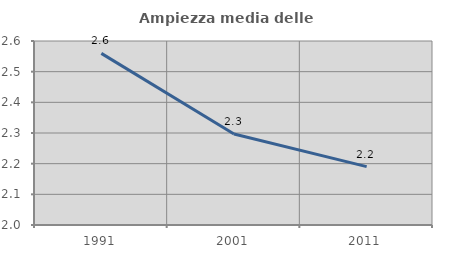
| Category | Ampiezza media delle famiglie |
|---|---|
| 1991.0 | 2.56 |
| 2001.0 | 2.297 |
| 2011.0 | 2.19 |